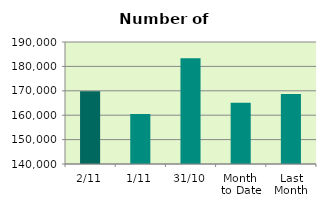
| Category | Series 0 |
|---|---|
| 2/11 | 169802 |
| 1/11 | 160462 |
| 31/10 | 183294 |
| Month 
to Date | 165132 |
| Last
Month | 168717.043 |